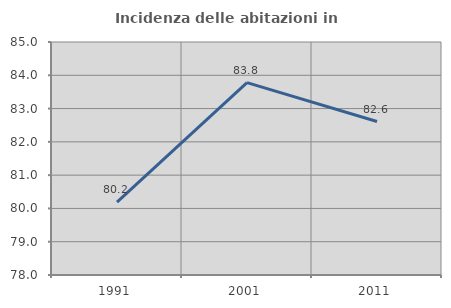
| Category | Incidenza delle abitazioni in proprietà  |
|---|---|
| 1991.0 | 80.192 |
| 2001.0 | 83.779 |
| 2011.0 | 82.611 |